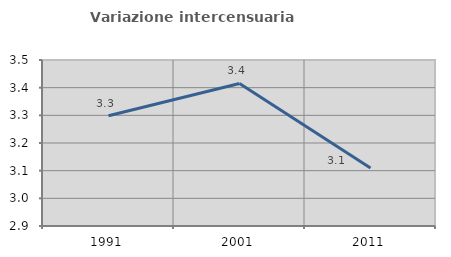
| Category | Variazione intercensuaria annua |
|---|---|
| 1991.0 | 3.298 |
| 2001.0 | 3.415 |
| 2011.0 | 3.11 |